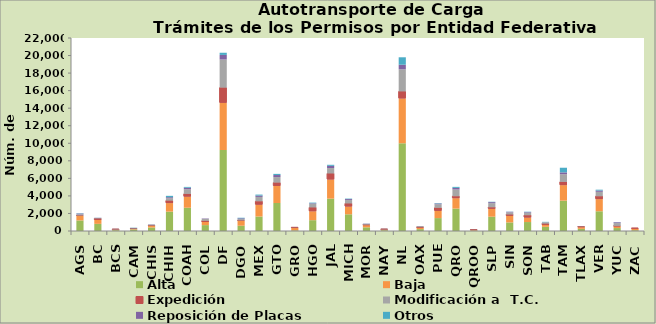
| Category | Alta                                         | Baja | Expedición | Modificación a  T.C. | Reposición de Placas | Otros |
|---|---|---|---|---|---|---|
| AGS | 1205 | 504 | 58 | 145 | 79 | 37 |
| BC | 813 | 450 | 147 | 58 | 32 | 12 |
| BCS | 91 | 72 | 14 | 55 | 9 | 5 |
| CAM | 177 | 59 | 43 | 32 | 11 | 47 |
| CHIS | 398 | 191 | 45 | 64 | 18 | 20 |
| CHIH | 2208 | 976 | 279 | 276 | 114 | 155 |
| COAH | 2652 | 1266 | 315 | 532 | 168 | 93 |
| COL | 672 | 359 | 128 | 223 | 46 | 3 |
| DF | 9232 | 5381 | 1726 | 3210 | 522 | 248 |
| DGO | 601 | 550 | 53 | 154 | 88 | 64 |
| MEX | 1651 | 1350 | 386 | 498 | 152 | 113 |
| GTO | 3191 | 1945 | 377 | 634 | 233 | 131 |
| GRO | 68 | 297 | 28 | 10 | 11 | 4 |
| HGO | 1234 | 1017 | 432 | 420 | 63 | 71 |
| JAL | 3689 | 2184 | 682 | 623 | 250 | 119 |
| MICH | 1904 | 885 | 351 | 389 | 111 | 52 |
| MOR | 420 | 247 | 48 | 76 | 38 | 13 |
| NAY | 85 | 79 | 28 | 48 | 12 | 4 |
| NL | 10000 | 5111 | 799 | 2522 | 521 | 848 |
| OAX | 215 | 157 | 68 | 98 | 7 | 6 |
| PUE | 1472 | 824 | 346 | 400 | 95 | 46 |
| QRO | 2553 | 1188 | 226 | 763 | 183 | 117 |
| QROO | 49 | 57 | 45 | 24 | 6 | 1 |
| SLP | 1629 | 904 | 169 | 471 | 120 | 40 |
| SIN | 978 | 752 | 148 | 246 | 65 | 21 |
| SON | 1021 | 513 | 269 | 275 | 70 | 50 |
| TAB | 479 | 223 | 134 | 154 | 12 | 42 |
| TAM | 3459 | 1771 | 365 | 878 | 208 | 530 |
| TLAX | 244 | 200 | 37 | 30 | 15 | 3 |
| VER | 2250 | 1386 | 328 | 502 | 144 | 99 |
| YUC | 336 | 198 | 47 | 323 | 89 | 15 |
| ZAC | 86 | 194 | 24 | 0 | 1 | 1 |